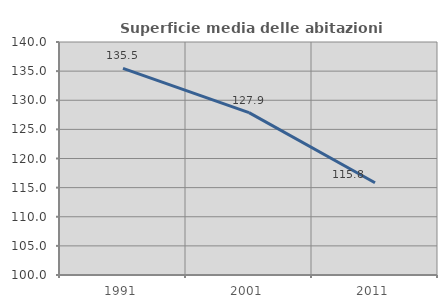
| Category | Superficie media delle abitazioni occupate |
|---|---|
| 1991.0 | 135.474 |
| 2001.0 | 127.871 |
| 2011.0 | 115.832 |